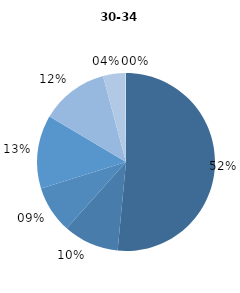
| Category | Series 0 |
|---|---|
| 0 | 51.505 |
| 1 | 10.104 |
| 2 | 8.574 |
| 3 | 13.345 |
| 4 | 0 |
| 5 | 12.311 |
| 6 | 4.007 |
| 7 | 0.153 |